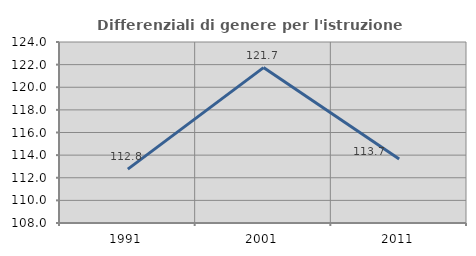
| Category | Differenziali di genere per l'istruzione superiore |
|---|---|
| 1991.0 | 112.76 |
| 2001.0 | 121.737 |
| 2011.0 | 113.666 |